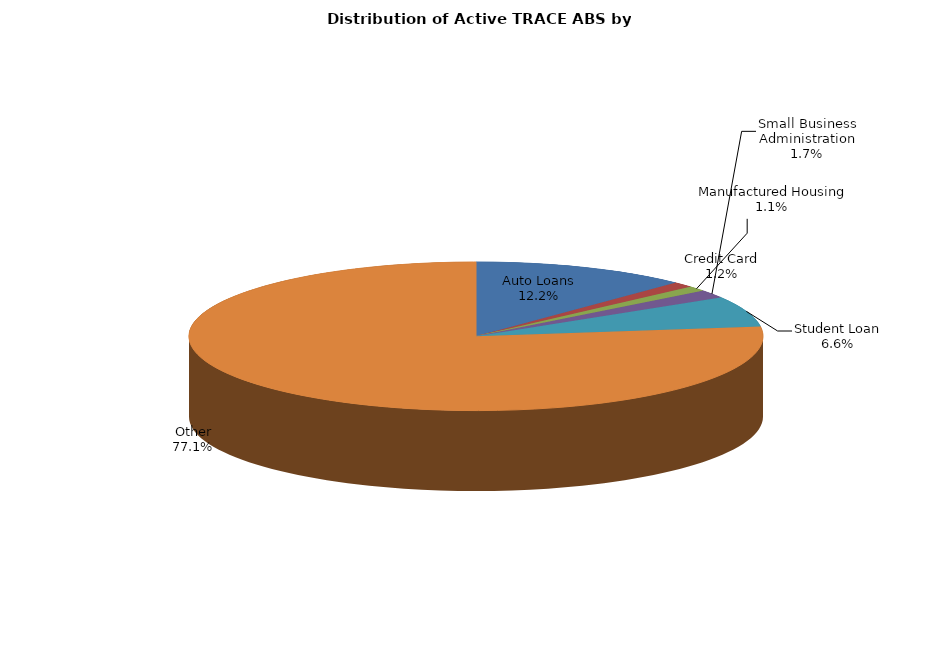
| Category | Series 0 |
|---|---|
| Auto Loans | 2549 |
| Credit Card | 248 |
| Manufactured Housing | 226 |
| Small Business Administration | 364 |
| Student Loan | 1386 |
| Other | 16093 |